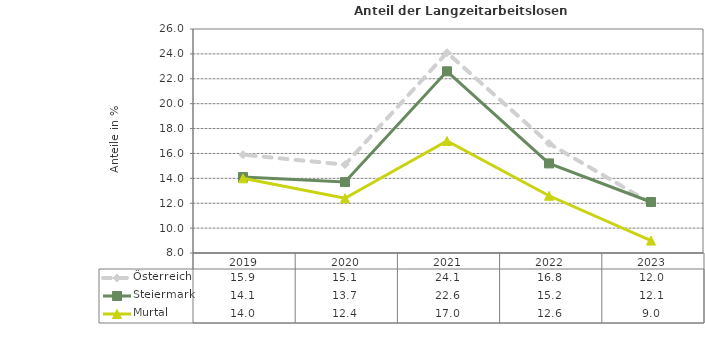
| Category | Österreich | Steiermark | Murtal |
|---|---|---|---|
| 2023.0 | 12 | 12.1 | 9 |
| 2022.0 | 16.8 | 15.2 | 12.6 |
| 2021.0 | 24.1 | 22.6 | 17 |
| 2020.0 | 15.1 | 13.7 | 12.4 |
| 2019.0 | 15.9 | 14.1 | 14 |